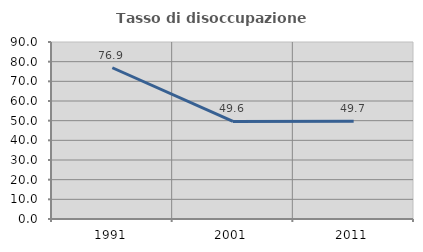
| Category | Tasso di disoccupazione giovanile  |
|---|---|
| 1991.0 | 76.908 |
| 2001.0 | 49.618 |
| 2011.0 | 49.73 |